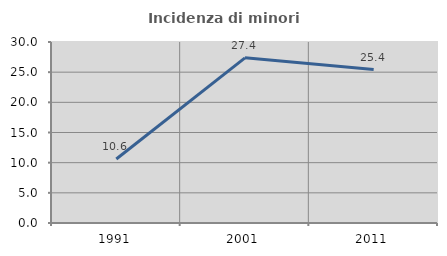
| Category | Incidenza di minori stranieri |
|---|---|
| 1991.0 | 10.606 |
| 2001.0 | 27.371 |
| 2011.0 | 25.44 |